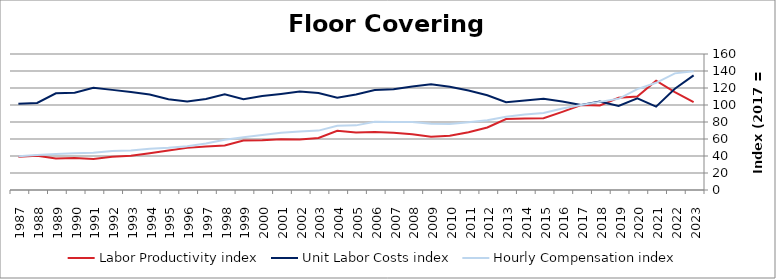
| Category | Labor Productivity index | Unit Labor Costs index | Hourly Compensation index |
|---|---|---|---|
| 2023.0 | 103.508 | 134.914 | 139.647 |
| 2022.0 | 115.194 | 119.105 | 137.201 |
| 2021.0 | 128.549 | 98.096 | 126.102 |
| 2020.0 | 110.081 | 107.862 | 118.735 |
| 2019.0 | 108.555 | 98.785 | 107.236 |
| 2018.0 | 99.54 | 104.162 | 103.683 |
| 2017.0 | 100 | 100 | 100 |
| 2016.0 | 91.937 | 104.17 | 95.771 |
| 2015.0 | 84.33 | 107.3 | 90.486 |
| 2014.0 | 84.215 | 105.389 | 88.753 |
| 2013.0 | 83.441 | 103.246 | 86.149 |
| 2012.0 | 73.592 | 111.47 | 82.033 |
| 2011.0 | 68.053 | 117.027 | 79.64 |
| 2010.0 | 63.908 | 121.341 | 77.547 |
| 2009.0 | 62.681 | 124.325 | 77.927 |
| 2008.0 | 65.571 | 121.88 | 79.918 |
| 2007.0 | 67.401 | 118.573 | 79.919 |
| 2006.0 | 68.173 | 117.657 | 80.21 |
| 2005.0 | 67.624 | 112.455 | 76.047 |
| 2004.0 | 69.662 | 108.502 | 75.584 |
| 2003.0 | 61.205 | 114.149 | 69.865 |
| 2002.0 | 59.329 | 115.782 | 68.693 |
| 2001.0 | 59.642 | 112.926 | 67.351 |
| 2000.0 | 58.614 | 110.489 | 64.762 |
| 1999.0 | 58.165 | 106.915 | 62.187 |
| 1998.0 | 52.474 | 112.578 | 59.074 |
| 1997.0 | 51.183 | 107.084 | 54.809 |
| 1996.0 | 49.559 | 104.015 | 51.549 |
| 1995.0 | 46.449 | 106.718 | 49.57 |
| 1994.0 | 43.263 | 112.304 | 48.586 |
| 1993.0 | 40.169 | 115.394 | 46.353 |
| 1992.0 | 39.047 | 117.796 | 45.995 |
| 1991.0 | 36.491 | 120.3 | 43.899 |
| 1990.0 | 37.671 | 114.413 | 43.101 |
| 1989.0 | 37.184 | 113.727 | 42.288 |
| 1988.0 | 40.297 | 102.482 | 41.297 |
| 1987.0 | 39.1 | 101.441 | 39.663 |